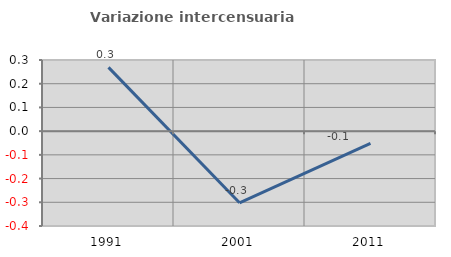
| Category | Variazione intercensuaria annua |
|---|---|
| 1991.0 | 0.269 |
| 2001.0 | -0.302 |
| 2011.0 | -0.052 |